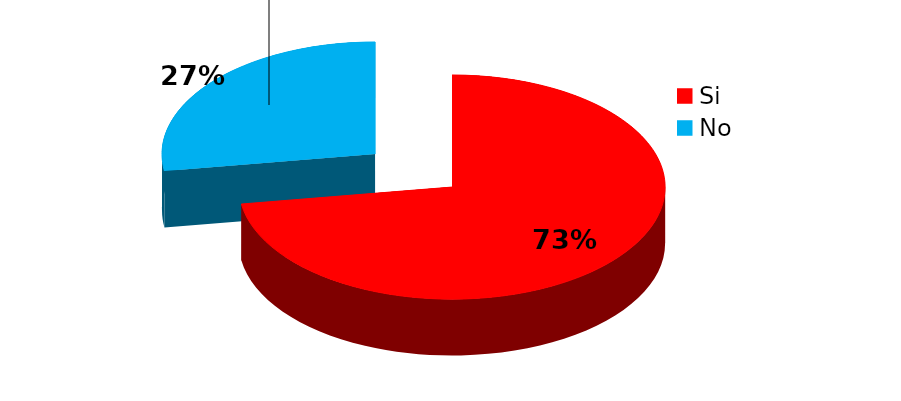
| Category | Series 0 |
|---|---|
| Si | 45 |
| No | 17 |